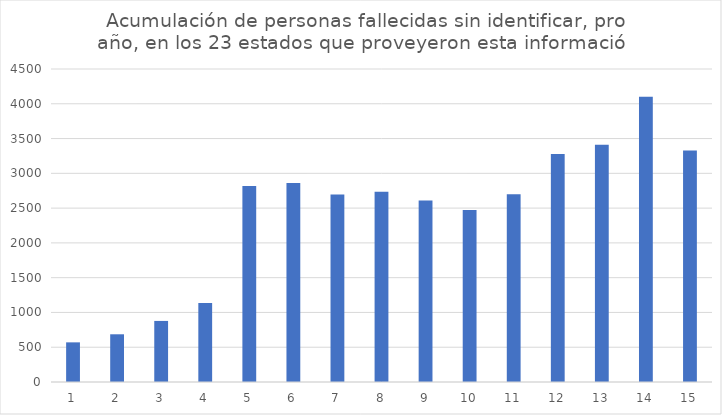
| Category | Series 0 |
|---|---|
| 0 | 570 |
| 1 | 686 |
| 2 | 878 |
| 3 | 1136 |
| 4 | 2819 |
| 5 | 2860 |
| 6 | 2696 |
| 7 | 2736 |
| 8 | 2611 |
| 9 | 2473 |
| 10 | 2699 |
| 11 | 3279 |
| 12 | 3412 |
| 13 | 4100 |
| 14 | 3329 |